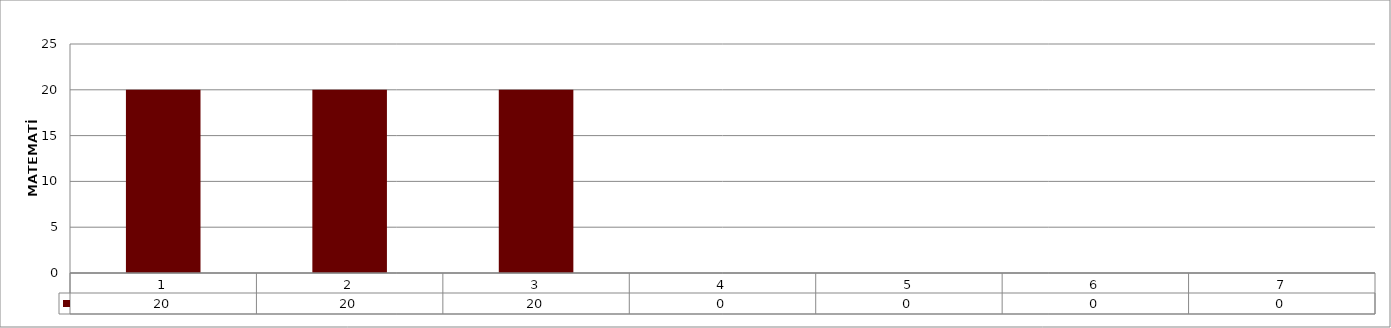
| Category | Series 0 |
|---|---|
| 0 | 20 |
| 1 | 20 |
| 2 | 20 |
| 3 | 0 |
| 4 | 0 |
| 5 | 0 |
| 6 | 0 |